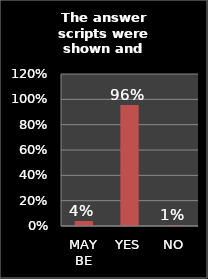
| Category | Series 0 |
|---|---|
| MAY BE | 0.039 |
| YES | 0.956 |
| NO | 0.005 |